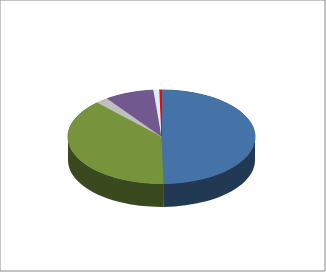
| Category | Total | % Sobre el Total |
|---|---|---|
| Cuerpo Nacional de Policía | 11363 | 0 |
| Guardia Civil | 8762 | 0 |
| D.A.II.EE. | 504 | 0 |
| Mossos d'Esquadra | 1931 | 0 |
| Ertzaintza | 233 | 0 |
| Policía Foral de Navarra  | 85 | 0 |